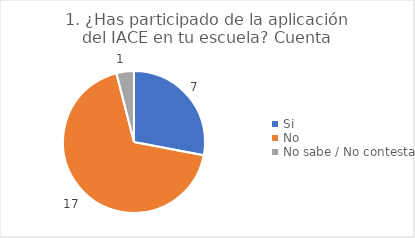
| Category | 1. ¿Has participado de la aplicación del IACE en tu escuela? |
|---|---|
| Si  | 0.28 |
| No  | 0.68 |
| No sabe / No contesta | 0.04 |